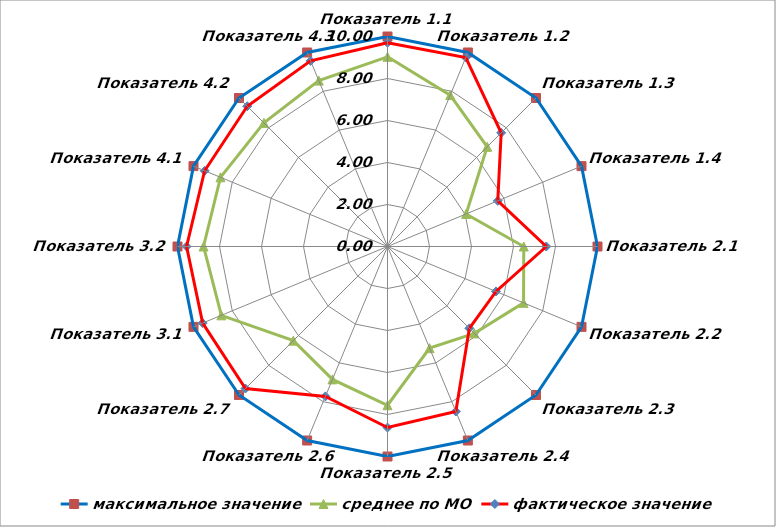
| Category | максимальное значение | среднее по МО | фактическое значение |
|---|---|---|---|
| Показатель 1.1 | 10 | 9.033 | 9.704 |
| Показатель 1.2 | 10 | 7.803 | 9.741 |
| Показатель 1.3 | 10 | 6.713 | 7.656 |
| Показатель 1.4 | 10 | 4.051 | 5.684 |
| Показатель 2.1 | 10 | 6.489 | 7.56 |
| Показатель 2.2 | 10 | 7.011 | 5.593 |
| Показатель 2.3 | 10 | 5.851 | 5.513 |
| Показатель 2.4 | 10 | 5.239 | 8.504 |
| Показатель 2.5 | 10 | 7.56 | 8.62 |
| Показатель 2.6 | 10 | 6.849 | 7.725 |
| Показатель 2.7 | 10 | 6.342 | 9.565 |
| Показатель 3.1 | 10 | 8.563 | 9.527 |
| Показатель 3.2 | 10 | 8.76 | 9.568 |
| Показатель 4.1 | 10 | 8.608 | 9.425 |
| Показатель 4.2 | 10 | 8.323 | 9.444 |
| Показатель 4.3 | 10 | 8.551 | 9.568 |